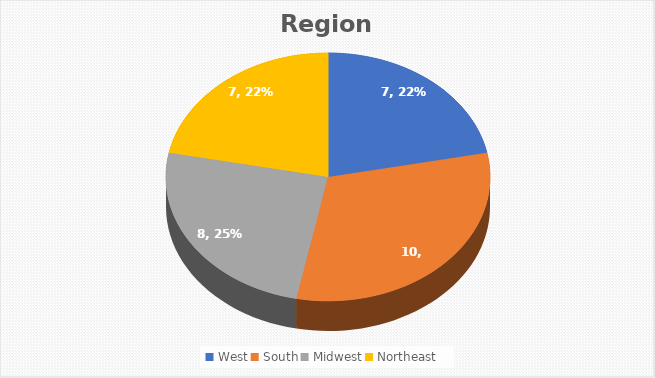
| Category | Totals |
|---|---|
| West | 7 |
| South | 10 |
| Midwest | 8 |
| Northeast | 7 |